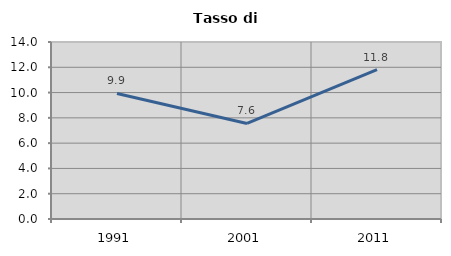
| Category | Tasso di disoccupazione   |
|---|---|
| 1991.0 | 9.932 |
| 2001.0 | 7.558 |
| 2011.0 | 11.807 |